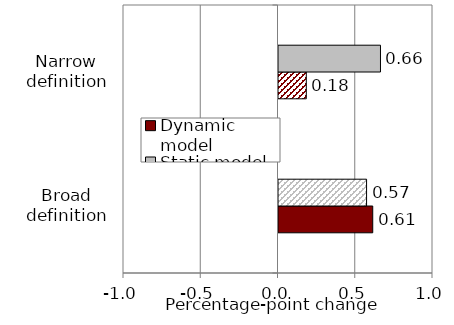
| Category | Dynamic model | Static model |
|---|---|---|
| Broad definition | 0.61 | 0.57 |
| Narrow definition | 0.18 | 0.66 |